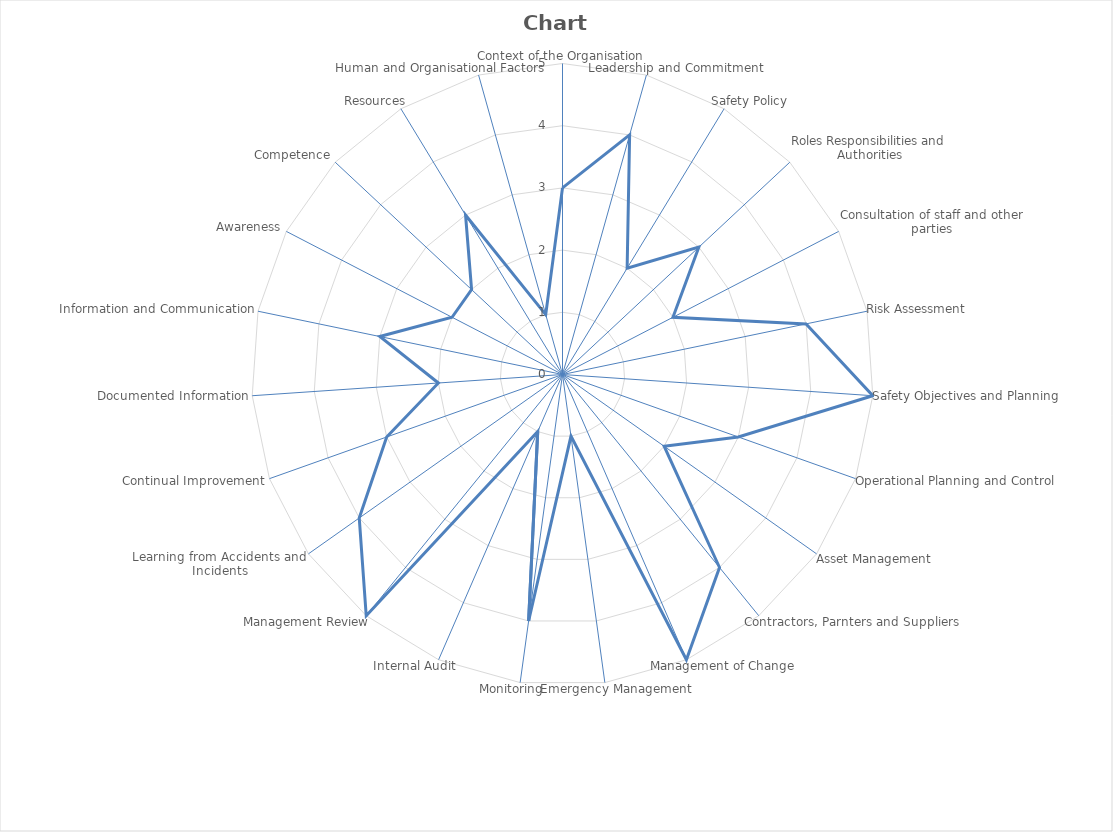
| Category | Series 0 |
|---|---|
| Context of the Organisation | 3 |
| Leadership and Commitment | 4 |
| Safety Policy | 2 |
| Roles Responsibilities and Authorities | 3 |
| Consultation of staff and other parties | 2 |
| Risk Assessment | 4 |
| Safety Objectives and Planning | 5 |
| Operational Planning and Control | 3 |
| Asset Management | 2 |
| Contractors, Parnters and Suppliers  | 4 |
| Management of Change | 5 |
| Emergency Management | 1 |
| Monitoring | 4 |
| Internal Audit | 1 |
| Management Review | 5 |
| Learning from Accidents and Incidents | 4 |
| Continual Improvement | 3 |
| Documented Information | 2 |
| Information and Communication | 3 |
| Awareness | 2 |
| Competence | 2 |
| Resources | 3 |
| Human and Organisational Factors | 1 |